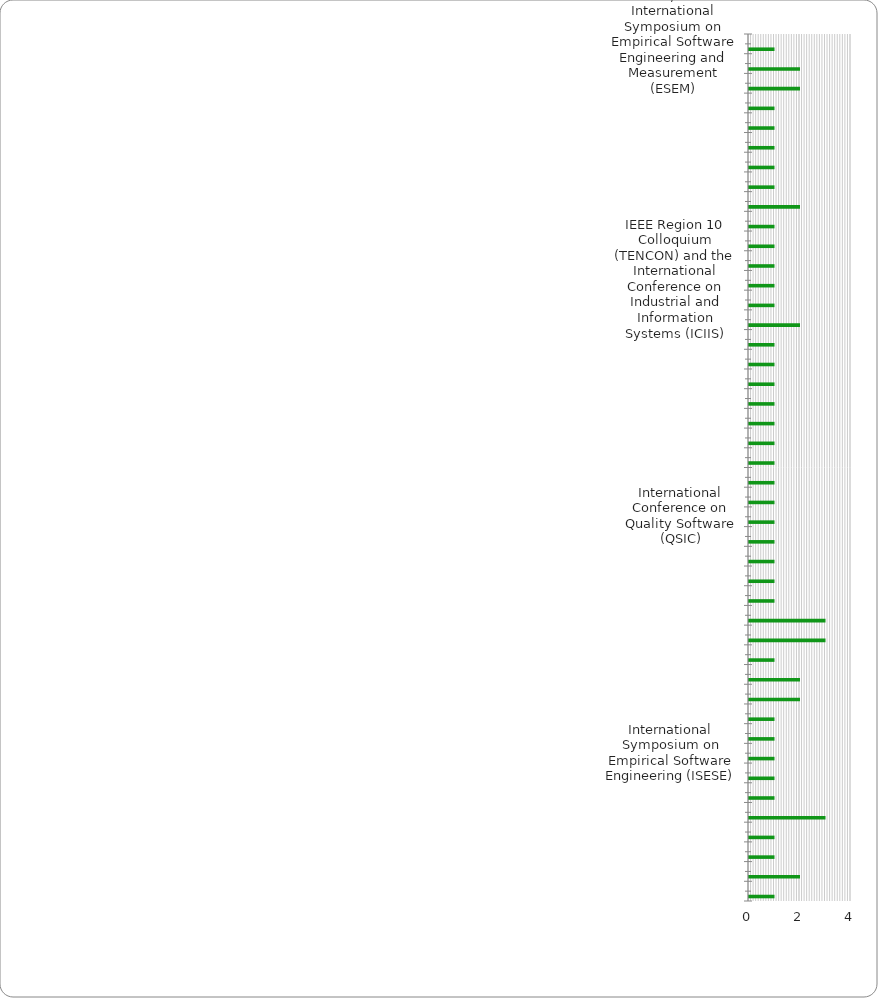
| Category | Series 0 | Series 1 | Series 2 | Number of papers |
|---|---|---|---|---|
| ACM/IEEE International Symposium on Empirical Software Engineering and Measurement (ESEM) |  |  |  | 1 |
| Agile Conference (Agile) |  |  |  | 2 |
| Annual International Symposium of the International Council on Systems Engineering (INCOSE) |  |  |  | 2 |
| Asia-Pacific Software Engineering Conference (APSEC) |  |  |  | 1 |
| Australian Software Engineering Conference (ASWEC) |  |  |  | 1 |
| European Conference on Software Maintenance and Reengineering (CSMR) |  |  |  | 1 |
| European Software Engineering Conference Held Jointly with ACM SIGSOFT International Symposium on Foundations of Software Engineering. Association for Computing Machinery |  |  |  | 1 |
| IEEE International Conference on Engineering of Complex Computer Systems (ICECCS) |  |  |  | 1 |
| IEEE International Conference on Software Maintenance (ICSM) |  |  |  | 2 |
| IEEE International Engineering Management Conference (IEMC) |  |  |  | 1 |
| IEEE International Instrumentation and Measurement Technology Conference (I2MTC ) |  |  |  | 1 |
| IEEE International Systems Conference (SysCon) |  |  |  | 1 |
| IEEE Region 10 Colloquium (TENCON) and the International Conference on Industrial and Information Systems (ICIIS) |  |  |  | 1 |
| IEEE Software Engineering Workshop (SEW) |  |  |  | 1 |
| IEEE/ACIS International Conference on Computer and Information Science (ICIS) |  |  |  | 2 |
| IEEE/ACM International Conference on Automated Software Engineering (ASE) |  |  |  | 1 |
| International Conference of the Computer Measurement Group (CMG) |  |  |  | 1 |
| International Conference on Advanced Software Engineering & Its Applications (ASEA) |  |  |  | 1 |
| International Conference on Circuit, Power and Computing Technologies (ICCPCT) |  |  |  | 1 |
| International Conference on Computational Intelligence for Modelling Control and Automation (CIMCA) |  |  |  | 1 |
| International Conference on Computational Intelligence for Modelling, Control and Automation (CIMCA) and International Conference on Intelligent Agents, Web Technologies and Internet Commerce (IAWTIC) |  |  |  | 1 |
| International Conference on Information and Computing Science (ICIC) |  |  |  | 1 |
| International Conference on Management and Service Science (MASS) |  |  |  | 1 |
| International Conference on Product-Focused Software Process Improvement (PROFES) |  |  |  | 1 |
| International Conference on Quality Software (QSIC) |  |  |  | 1 |
| International Conference on Reliability, Infocom Technologies and Optimization (Trends and Future Directions) (ICRITO) |  |  |  | 1 |
| International Conference on Software and Data Technologies (ICSOFT) |  |  |  | 1 |
| International Conference on Software Engineering and Applications (IASTED) |  |  |  | 1 |
| International Conference on Software Engineering and Knowledge Engineering (SEKE) |  |  |  | 1 |
| International Conference on Software Engineering (ICSE) |  |  |  | 3 |
| International Conference on Software Process Improvement and Capability Determination (SPICE) |  |  |  | 3 |
| International Conference on Software Process: Trustworthy Software Development Processes (ICSP) |  |  |  | 1 |
| International Conference on Systems, Computing Sciences and Software Engineering (SCSS), part of the International Joint Conferences on Computer, Information, and Systems Sciences, and Engineering (CISSE) |  |  |  | 2 |
| International Conference on the Quality of Information and Communications Technology (QUATIC) |  |  |  | 2 |
| International Conference on Wireless Communications, Networking and Mobile Computing (WiCOM) |  |  |  | 1 |
| International Multi Conference on Information Processing (IMCIP) |  |  |  | 1 |
| International Symposium on Empirical Software Engineering (ISESE) |  |  |  | 1 |
| International Workshop on Software Measurement (IWSM) |  |  |  | 1 |
| Joint Conference on Knowledge-Based Software Engineering (JCKBSE) |  |  |  | 1 |
| Joint Conference of the International Workshop on Software Measurement (IWSM) and the International Conference on Software Process and Product Measurement (Mensura) |  |  |  | 3 |
| Joint International Computer Conference (JICC) |  |  |  | 1 |
| Joint International Conference on Performance Engineering (WOSP/SIPEW) |  |  |  | 1 |
| Latin American Computing Conference (CLEI) |  |  |  | 2 |
| Malaysian Software Engineering Conference (MySEC) |  |  |  | 1 |